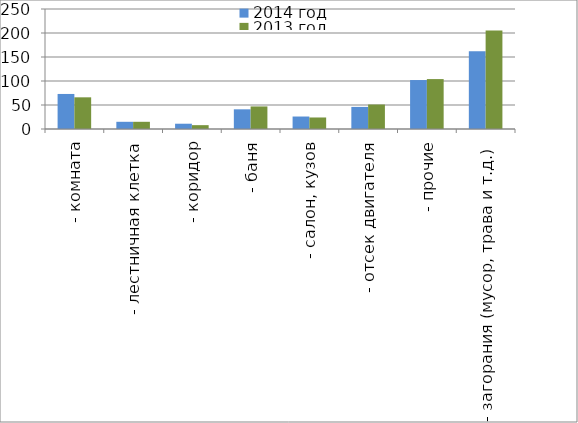
| Category | 2014 год | 2013 год |
|---|---|---|
|  - комната | 73 | 66 |
|  - лестничная клетка | 15 | 15 |
|  - коридор | 11 | 8 |
|  - баня | 41 | 47 |
|  - салон, кузов | 26 | 24 |
|  - отсек двигателя | 46 | 51 |
| - прочие | 102 | 104 |
| - загорания (мусор, трава и т.д.)  | 162 | 205 |